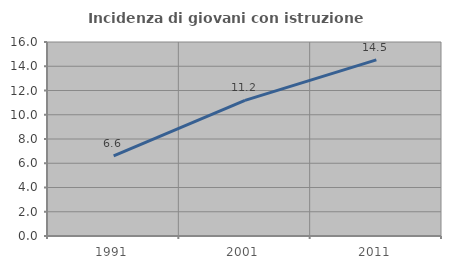
| Category | Incidenza di giovani con istruzione universitaria |
|---|---|
| 1991.0 | 6.618 |
| 2001.0 | 11.184 |
| 2011.0 | 14.53 |